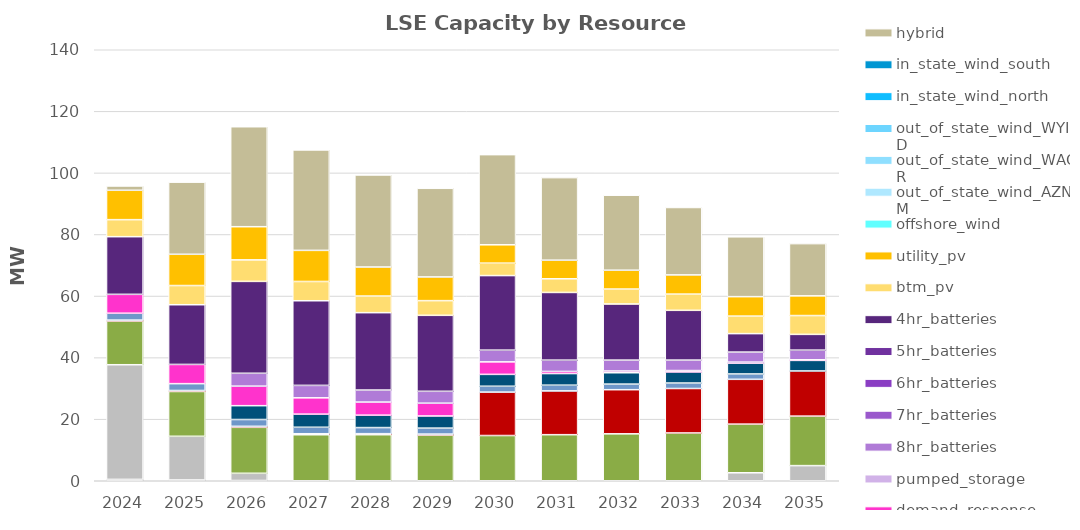
| Category | unspecified_import | steam | coal | ice | cogen | gas_ct | gas_cc | nuclear | biogas | biomass_wood | geothermal | small_hydro | hydro | demand_response | pumped_storage | 8hr_batteries | 7hr_batteries | 6hr_batteries | 5hr_batteries | 4hr_batteries | btm_pv | utility_pv | offshore_wind | out_of_state_wind_AZNM | out_of_state_wind_WAOR | out_of_state_wind_WYID | in_state_wind_north | in_state_wind_south | hybrid |
|---|---|---|---|---|---|---|---|---|---|---|---|---|---|---|---|---|---|---|---|---|---|---|---|---|---|---|---|---|---|
| 2024.0 | 0 | 0 | 0 | 0 | 0.439 | 0 | 37.25 | 0 | 0 | 14.18 | 0.314 | 2.235 | 0 | 6.135 | 0 | 0 | 0 | 0 | 0 | 18.728 | 5.53 | 9.542 | 0 | 0 | 0 | 0 | 0 | 0 | 1.394 |
| 2025.0 | 0 | 0 | 0 | 0 | 0.248 | 0 | 14.193 | 0 | 0 | 14.557 | 0.32 | 2.224 | 0 | 6.24 | 0 | 0 | 0 | 0 | 0 | 19.394 | 6.231 | 10.159 | 0 | 0 | 0 | 0 | 0 | 0 | 23.433 |
| 2026.0 | 0 | 0 | 0 | 0 | 0.078 | 0 | 2.344 | 0 | 0 | 14.935 | 0.325 | 2.214 | 4.49 | 6.346 | 0 | 4.183 | 0 | 0 | 0 | 29.847 | 6.989 | 10.775 | 0 | 0 | 0 | 0 | 0 | 0 | 32.473 |
| 2027.0 | 0 | 0 | 0 | 0 | 0 | 0 | 0 | 0 | 0 | 14.945 | 0.331 | 2.098 | 4.255 | 5.306 | 0 | 4.044 | 0 | 0 | 0 | 27.49 | 6.258 | 10.107 | 0 | 0 | 0 | 0 | 0 | 0 | 32.619 |
| 2028.0 | 0 | 0 | 0 | 0 | 0 | 0 | 0 | 0 | 0 | 14.956 | 0.338 | 1.983 | 4.021 | 4.266 | 0 | 3.904 | 0 | 0 | 0 | 25.132 | 5.392 | 9.439 | 0 | 0 | 0 | 0 | 0 | 0 | 29.894 |
| 2029.0 | 0 | 0 | 0 | 0 | 0 | 0 | 0 | 0 | 0 | 14.822 | 0.336 | 1.943 | 3.94 | 4.163 | 0 | 3.857 | 0 | 0 | 0 | 24.677 | 4.768 | 7.701 | 0 | 0 | 0 | 0 | 0 | 0 | 28.785 |
| 2030.0 | 0 | 0 | 0 | 0 | 0 | 0 | 0 | 0 | 0 | 14.688 | 14.106 | 1.903 | 3.859 | 4.06 | 0 | 3.81 | 0 | 0 | 0 | 24.222 | 4.036 | 5.964 | 0 | 0 | 0 | 0 | 0 | 0 | 29.286 |
| 2031.0 | 0 | 0 | 0 | 0 | 0 | 0 | 0 | 0 | 0 | 14.967 | 14.218 | 1.861 | 3.775 | 0.687 | 0 | 3.674 | 0 | 0 | 0 | 21.985 | 4.434 | 6.044 | 0 | 0 | 0 | 0 | 0 | 0 | 26.823 |
| 2032.0 | 0 | 0 | 0 | 0 | 0 | 0 | 0 | 0 | 0 | 15.246 | 14.33 | 1.82 | 3.691 | 0.565 | 0 | 3.538 | 0 | 0 | 0 | 18.23 | 4.849 | 6.123 | 0 | 0 | 0 | 0 | 0 | 0 | 24.359 |
| 2033.0 | 0 | 0 | 0 | 0 | 0 | 0 | 0 | 0 | 0 | 15.524 | 14.442 | 1.778 | 3.607 | 0.442 | 0 | 3.402 | 0 | 0 | 0 | 16.165 | 5.267 | 6.24 | 0 | 0 | 0 | 0 | 0 | 0 | 21.895 |
| 2034.0 | 0 | 0 | 0 | 0 | 0 | 0 | 2.592 | 0 | 0 | 15.803 | 14.554 | 1.737 | 3.523 | 0.32 | 0 | 3.266 | 0 | 0 | 0 | 5.996 | 5.691 | 6.32 | 0 | 0 | 0 | 0 | 0 | 0 | 19.432 |
| 2035.0 | 0 | 0 | 0 | 0 | 0 | 0 | 4.915 | 0 | 0 | 16.081 | 14.666 | 0 | 3.439 | 0.197 | 0 | 3.13 | 0 | 0 | 0 | 5.118 | 6.114 | 6.4 | 0 | 0 | 0 | 0 | 0 | 0 | 16.968 |